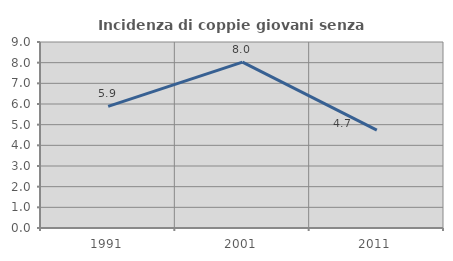
| Category | Incidenza di coppie giovani senza figli |
|---|---|
| 1991.0 | 5.882 |
| 2001.0 | 8.024 |
| 2011.0 | 4.735 |